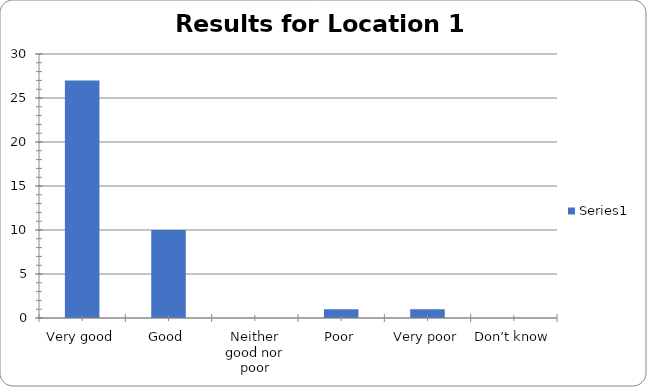
| Category | Series 0 |
|---|---|
| Very good | 27 |
| Good | 10 |
| Neither good nor poor | 0 |
| Poor | 1 |
| Very poor | 1 |
| Don’t know | 0 |